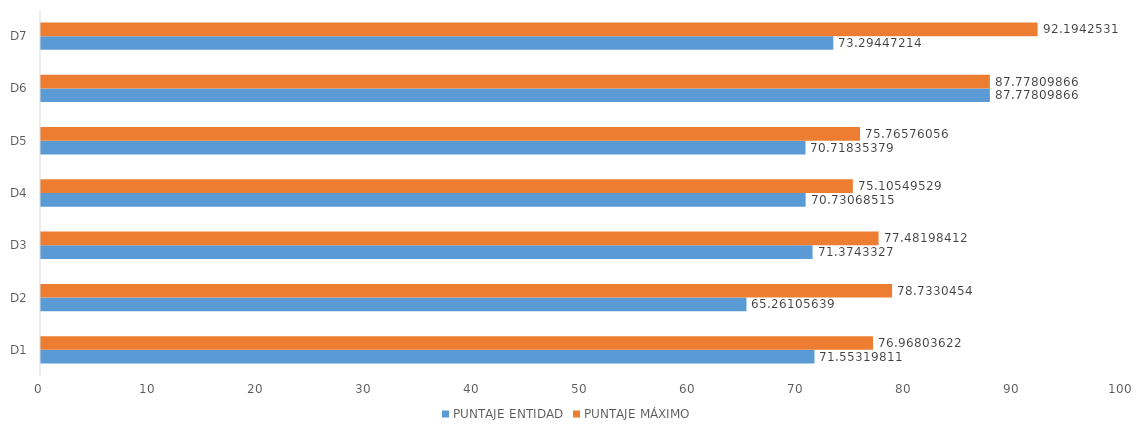
| Category | PUNTAJE ENTIDAD | PUNTAJE MÁXIMO |
|---|---|---|
| D1 | 71.553 | 76.968 |
| D2 | 65.261 | 78.733 |
| D3 | 71.374 | 77.482 |
| D4 | 70.731 | 75.105 |
| D5 | 70.718 | 75.766 |
| D6 | 87.778 | 87.778 |
| D7 | 73.294 | 92.194 |